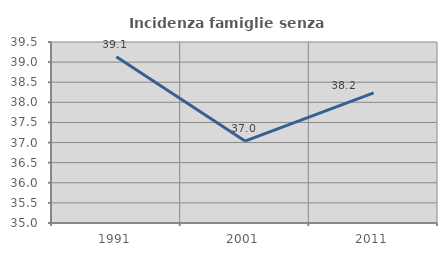
| Category | Incidenza famiglie senza nuclei |
|---|---|
| 1991.0 | 39.13 |
| 2001.0 | 37.037 |
| 2011.0 | 38.235 |